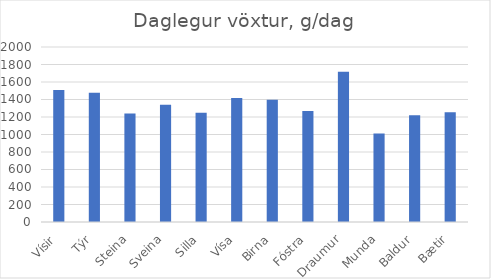
| Category | Series 0 |
|---|---|
| Vísir | 1509.317 |
| Týr | 1477.707 |
| Steina | 1240 |
| Sveina | 1340 |
| Silla | 1248.322 |
| Vísa | 1416.107 |
| Birna | 1395.973 |
| Fóstra | 1268.456 |
| Draumur | 1716.216 |
| Munda | 1010.204 |
| Baldur | 1219.178 |
| Bætir | 1253.425 |